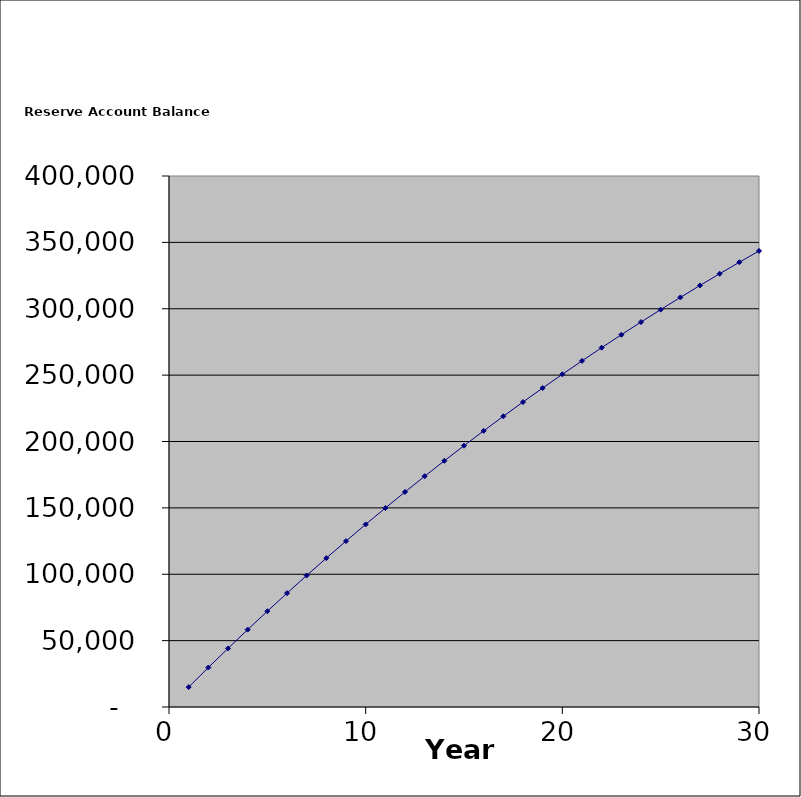
| Category | Series 0 |
|---|---|
| 0 | 15000 |
| 1 | 29708.738 |
| 2 | 44131.869 |
| 3 | 58274.94 |
| 4 | 72143.387 |
| 5 | 85742.545 |
| 6 | 99077.641 |
| 7 | 112153.803 |
| 8 | 124976.06 |
| 9 | 137549.34 |
| 10 | 149878.479 |
| 11 | 161968.217 |
| 12 | 173823.203 |
| 13 | 185447.996 |
| 14 | 196847.064 |
| 15 | 208024.791 |
| 16 | 218985.474 |
| 17 | 229733.329 |
| 18 | 240272.488 |
| 19 | 250607.003 |
| 20 | 260740.847 |
| 21 | 270677.918 |
| 22 | 280422.036 |
| 23 | 289976.948 |
| 24 | 299346.328 |
| 25 | 308533.778 |
| 26 | 317542.831 |
| 27 | 326376.95 |
| 28 | 335039.534 |
| 29 | 343533.912 |